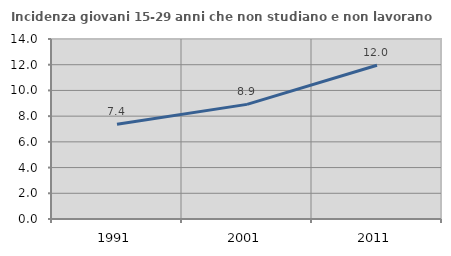
| Category | Incidenza giovani 15-29 anni che non studiano e non lavorano  |
|---|---|
| 1991.0 | 7.371 |
| 2001.0 | 8.915 |
| 2011.0 | 11.955 |